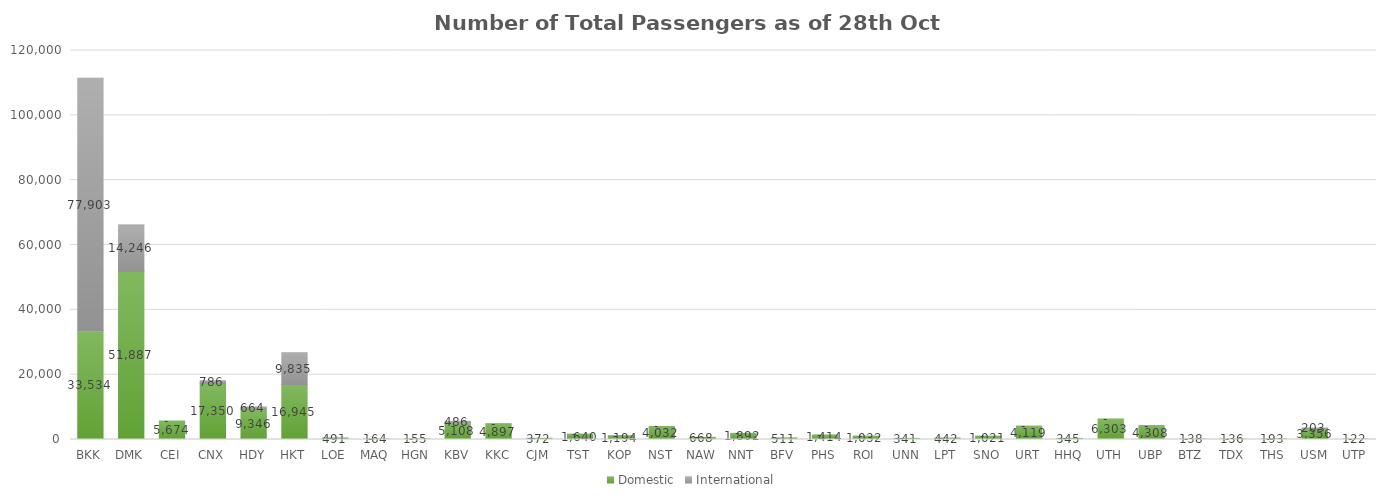
| Category | Domestic | International |
|---|---|---|
| BKK | 33534 | 77903 |
| DMK | 51887 | 14246 |
| CEI | 5674 | 0 |
| CNX | 17350 | 786 |
| HDY | 9346 | 664 |
| HKT | 16945 | 9835 |
| LOE | 491 | 0 |
| MAQ | 164 | 0 |
| HGN | 155 | 0 |
| KBV | 5108 | 486 |
| KKC | 4897 | 0 |
| CJM | 372 | 0 |
| TST | 1640 | 0 |
| KOP | 1194 | 0 |
| NST | 4032 | 0 |
| NAW | 668 | 0 |
| NNT | 1892 | 0 |
| BFV | 511 | 0 |
| PHS | 1414 | 0 |
| ROI | 1032 | 0 |
| UNN | 341 | 0 |
| LPT | 442 | 0 |
| SNO | 1021 | 0 |
| URT | 4119 | 0 |
| HHQ | 345 | 0 |
| UTH | 6303 | 0 |
| UBP | 4308 | 0 |
| BTZ | 138 | 0 |
| TDX | 136 | 0 |
| THS | 193 | 0 |
| USM | 3356 | 203 |
| UTP | 122 | 0 |